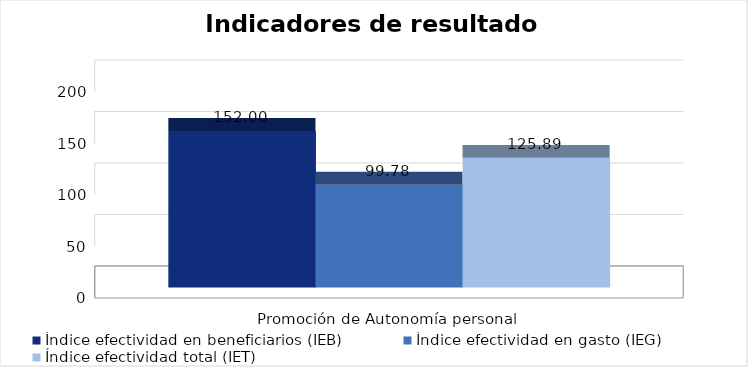
| Category | Índice efectividad en beneficiarios (IEB) | Índice efectividad en gasto (IEG)  | Índice efectividad total (IET) |
|---|---|---|---|
| Promoción de Autonomía personal  | 152 | 99.78 | 125.89 |